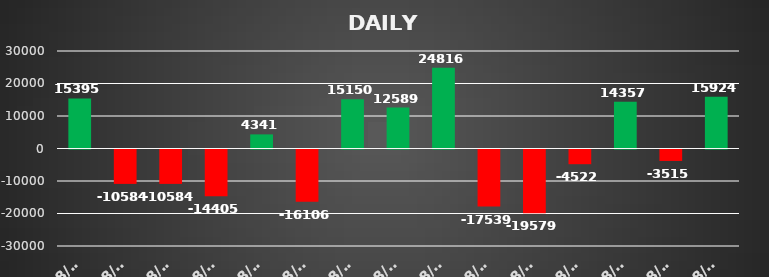
| Category | Series 0 |
|---|---|
| 2021-08-02 | 15395.105 |
| 2021-08-03 | -10583.604 |
| 2021-08-04 | -10583.604 |
| 2021-08-05 | -14404.625 |
| 2021-08-10 | 4340.875 |
| 2021-08-11 | -16105.988 |
| 2021-08-12 | 15150.286 |
| 2021-08-16 | 12589.48 |
| 2021-08-17 | 24816 |
| 2021-08-18 | -17539.26 |
| 2021-08-20 | -19579.272 |
| 2021-08-23 | -4522.35 |
| 2021-08-27 | 14357.4 |
| 2021-08-30 | -3514.74 |
| 2021-08-31 | 15923.91 |